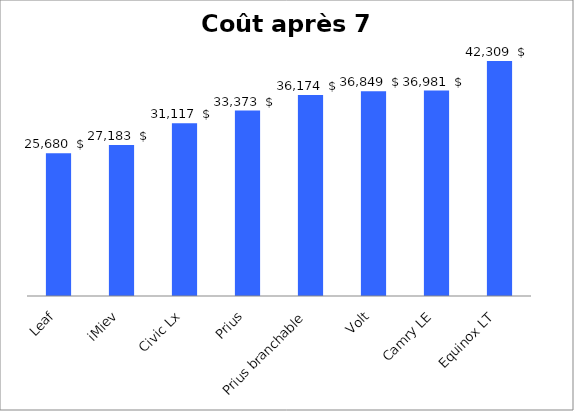
| Category | après 9 ans |
|---|---|
| Leaf | 25680 |
| iMiev | 27182.642 |
| Civic Lx | 31117.486 |
| Prius | 33373.085 |
| Prius branchable | 36174.365 |
| Volt | 36848.624 |
| Camry LE | 36981.361 |
| Equinox LT | 42309.482 |